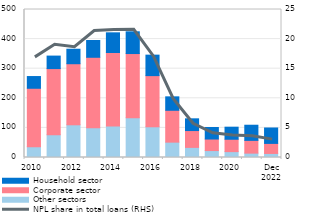
| Category | Other sectors | Corporate sector | Household sector |
|---|---|---|---|
| 2010 | 36.3 | 197.6 | 39.6 |
| 2011 | 77.1 | 223.3 | 42.2 |
| 2012 | 110.5 | 206.3 | 49 |
| 2013 | 100.2 | 238.4 | 56.7 |
| 2014 | 106.4 | 248.4 | 66.4 |
| 2015 | 134.4 | 216.8 | 73.4 |
| 2016 | 103.8 | 172.8 | 69.2 |
| 2017 | 51.9 | 107.6 | 45.4 |
| 2018 | 34.192 | 56.849 | 39.608 |
| 2019 | 23.45 | 38.949 | 39.017 |
| 2020 | 19.835 | 41.827 | 40.747 |
| 2021 | 14.723 | 43.14 | 51.148 |
| Dec
2022 | 13.706 | 33.931 | 52.057 |